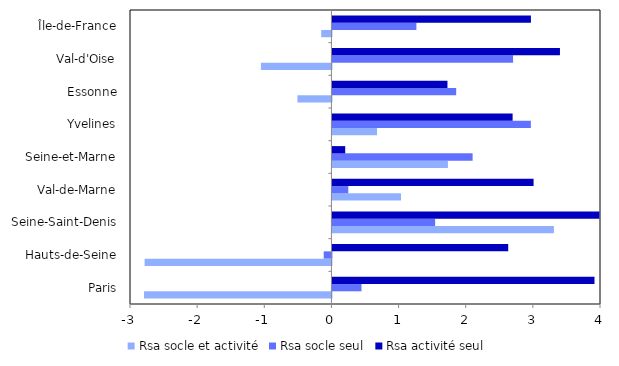
| Category | Rsa socle et activité | Rsa socle seul | Rsa activité seul |
|---|---|---|---|
| Paris | -2.791 | 0.433 | 3.903 |
| Hauts-de-Seine | -2.782 | -0.115 | 2.618 |
| Seine-Saint-Denis | 3.299 | 1.529 | 3.976 |
| Val-de-Marne | 1.022 | 0.236 | 2.996 |
| Seine-et-Marne | 1.72 | 2.088 | 0.191 |
| Yvelines | 0.665 | 2.955 | 2.684 |
| Essonne | -0.506 | 1.843 | 1.713 |
| Val-d'Oise | -1.05 | 2.691 | 3.389 |
| Île-de-France | -0.152 | 1.251 | 2.956 |